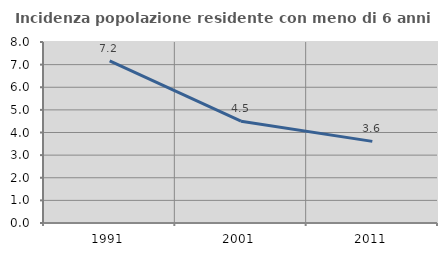
| Category | Incidenza popolazione residente con meno di 6 anni |
|---|---|
| 1991.0 | 7.17 |
| 2001.0 | 4.5 |
| 2011.0 | 3.607 |